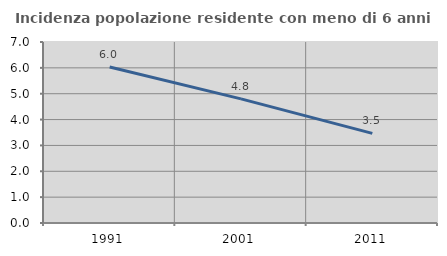
| Category | Incidenza popolazione residente con meno di 6 anni |
|---|---|
| 1991.0 | 6.031 |
| 2001.0 | 4.801 |
| 2011.0 | 3.467 |